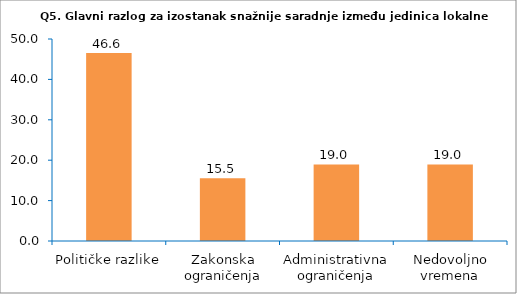
| Category | Series 0 |
|---|---|
| Političke razlike | 46.552 |
| Zakonska ograničenja | 15.517 |
| Administrativna ograničenja | 18.966 |
| Nedovoljno vremena | 18.966 |